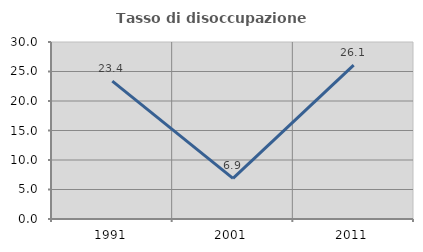
| Category | Tasso di disoccupazione giovanile  |
|---|---|
| 1991.0 | 23.364 |
| 2001.0 | 6.897 |
| 2011.0 | 26.087 |